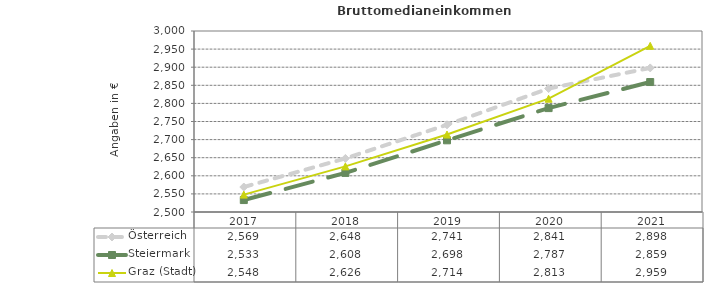
| Category | Österreich | Steiermark | Graz (Stadt) |
|---|---|---|---|
| 2021.0 | 2898 | 2859 | 2959 |
| 2020.0 | 2841 | 2787 | 2813 |
| 2019.0 | 2741 | 2698 | 2714 |
| 2018.0 | 2648 | 2608 | 2626 |
| 2017.0 | 2569 | 2533 | 2548 |